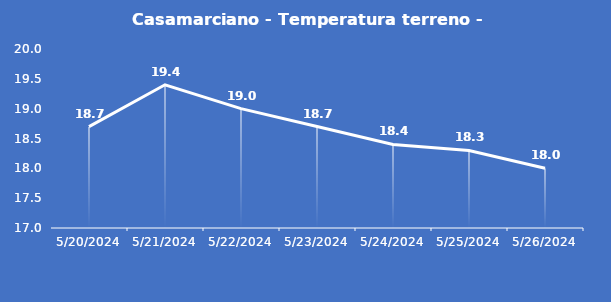
| Category | Casamarciano - Temperatura terreno - Grezzo (°C) |
|---|---|
| 5/20/24 | 18.7 |
| 5/21/24 | 19.4 |
| 5/22/24 | 19 |
| 5/23/24 | 18.7 |
| 5/24/24 | 18.4 |
| 5/25/24 | 18.3 |
| 5/26/24 | 18 |